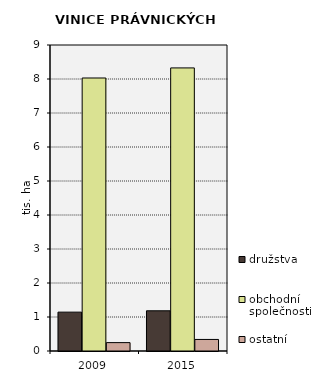
| Category | družstva | obchodní společnosti | ostatní |
|---|---|---|---|
| 2009.0 | 1143.293 | 8029.442 | 246.762 |
| 2015.0 | 1182.609 | 8325.984 | 339.91 |